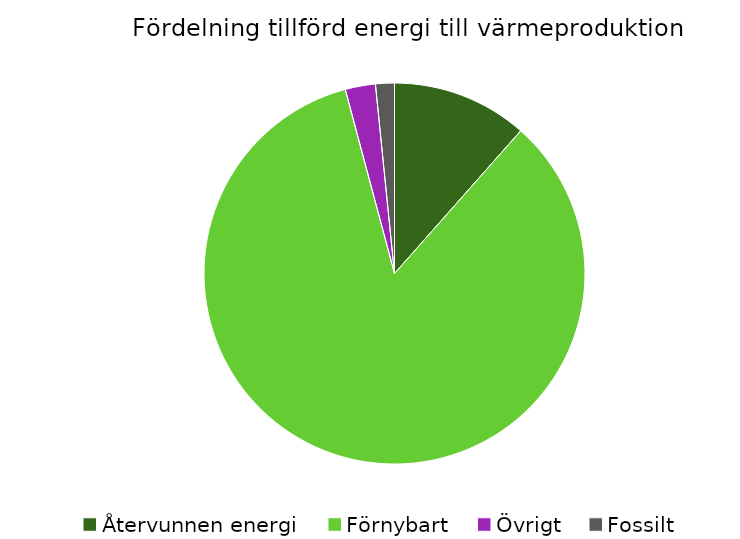
| Category | Fördelning värmeproduktion |
|---|---|
| Återvunnen energi | 0.115 |
| Förnybart | 0.843 |
| Övrigt | 0.026 |
| Fossilt | 0.016 |